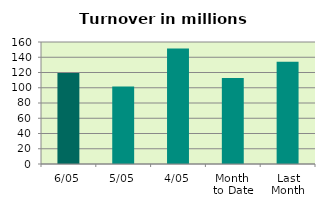
| Category | Series 0 |
|---|---|
| 6/05 | 119.211 |
| 5/05 | 101.777 |
| 4/05 | 151.373 |
| Month 
to Date | 112.797 |
| Last
Month | 133.981 |